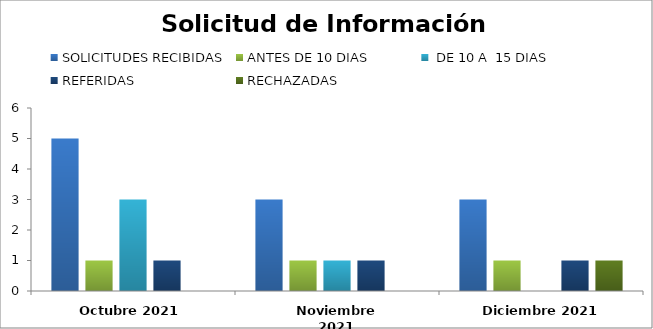
| Category | SOLICITUDES RECIBIDAS | ANTES DE 10 DIAS |  DE 10 A  15 DIAS  | REFERIDAS | RECHAZADAS | FUERA DE PLAZO |
|---|---|---|---|---|---|---|
| Octubre 2021 | 5 | 1 | 3 | 1 | 0 |  |
| Noviembre 2021 | 3 | 1 | 1 | 1 | 0 |  |
| Diciembre 2021 | 3 | 1 | 0 | 1 | 1 |  |